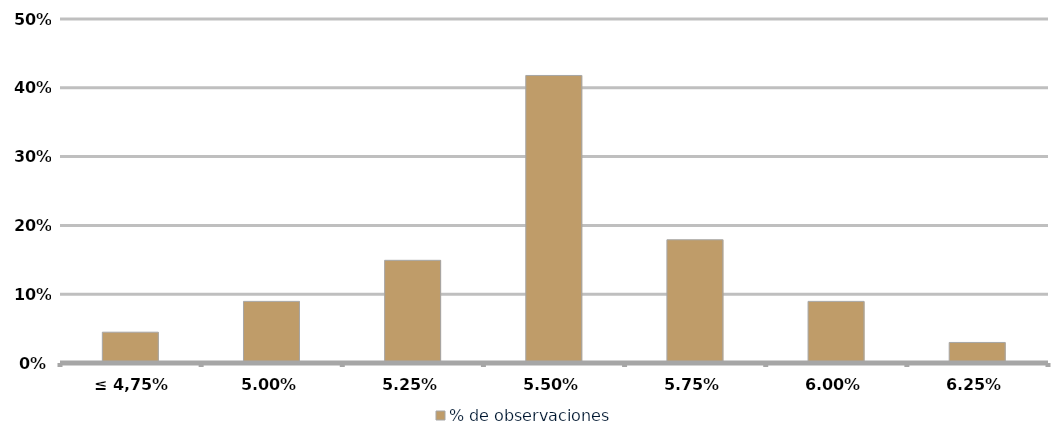
| Category | % de observaciones  |
|---|---|
| ≤ 4,75% | 0.045 |
| 5,00% | 0.09 |
| 5,25% | 0.149 |
| 5,50% | 0.418 |
| 5,75% | 0.179 |
| 6,00% | 0.09 |
| 6,25% | 0.03 |